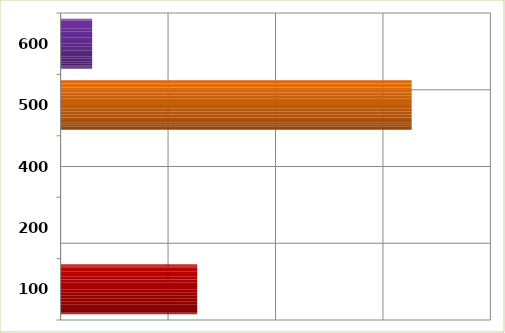
| Category | Series 0 |
|---|---|
| 100.0 | 63563342 |
| 200.0 | 0 |
| 400.0 | 0 |
| 500.0 | 163366019.5 |
| 600.0 | 14679546 |